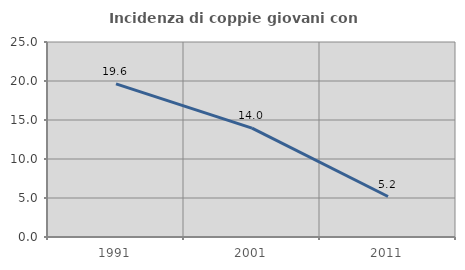
| Category | Incidenza di coppie giovani con figli |
|---|---|
| 1991.0 | 19.636 |
| 2001.0 | 13.966 |
| 2011.0 | 5.191 |